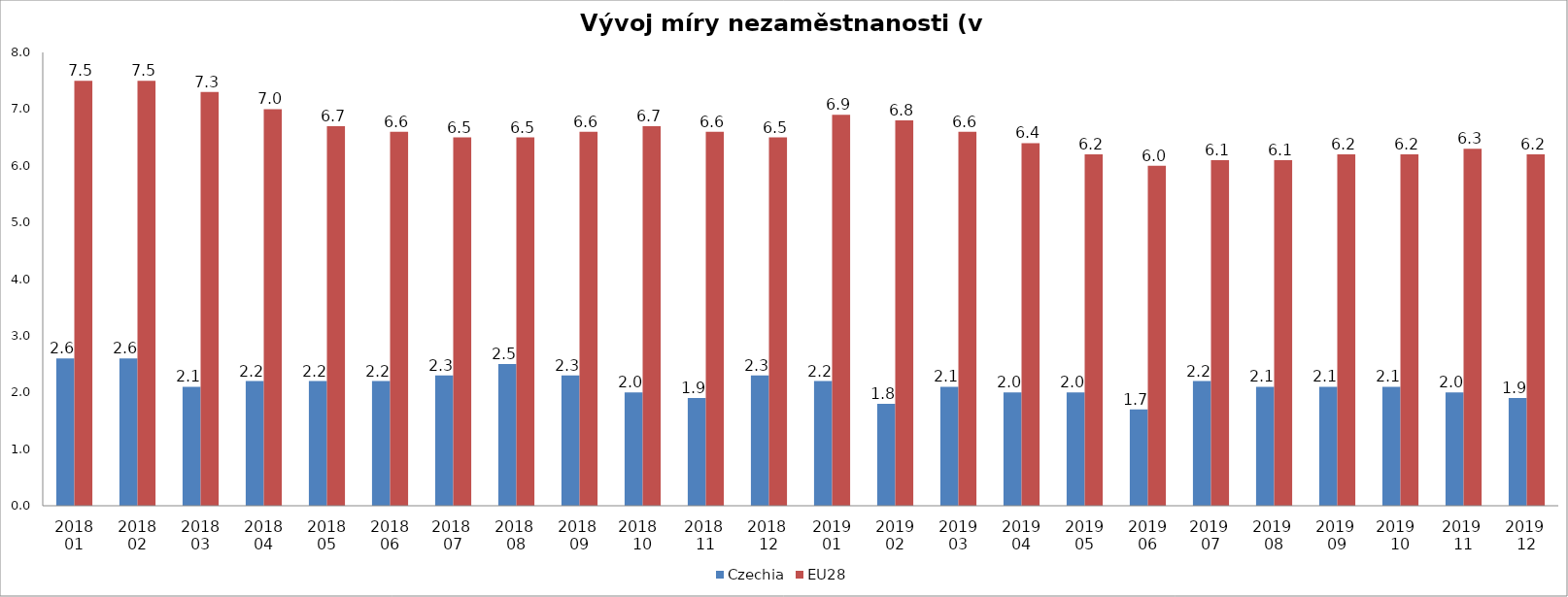
| Category | Czechia | EU28 |
|---|---|---|
| 2018 01 | 2.6 | 7.5 |
| 2018 02 | 2.6 | 7.5 |
| 2018 03 | 2.1 | 7.3 |
| 2018 04 | 2.2 | 7 |
| 2018 05 | 2.2 | 6.7 |
| 2018 06 | 2.2 | 6.6 |
| 2018  07 | 2.3 | 6.5 |
| 2018  08 | 2.5 | 6.5 |
| 2018  09 | 2.3 | 6.6 |
| 2018   10 | 2 | 6.7 |
| 2018  11 | 1.9 | 6.6 |
| 2018  12 | 2.3 | 6.5 |
| 2019 01 | 2.2 | 6.9 |
| 2019 02 | 1.8 | 6.8 |
| 2019 03 | 2.1 | 6.6 |
| 2019 04 | 2 | 6.4 |
| 2019 05 | 2 | 6.2 |
| 2019 06 | 1.7 | 6 |
| 2019  07 | 2.2 | 6.1 |
| 2019  08 | 2.1 | 6.1 |
| 2019  09 | 2.1 | 6.2 |
| 2019   10 | 2.1 | 6.2 |
| 2019  11 | 2 | 6.3 |
| 2019  12 | 1.9 | 6.2 |